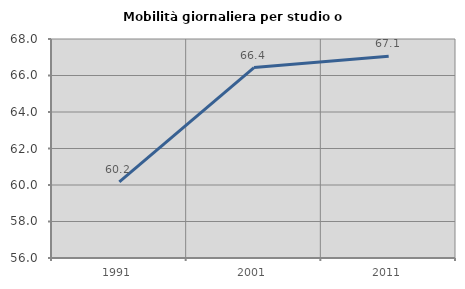
| Category | Mobilità giornaliera per studio o lavoro |
|---|---|
| 1991.0 | 60.166 |
| 2001.0 | 66.432 |
| 2011.0 | 67.05 |